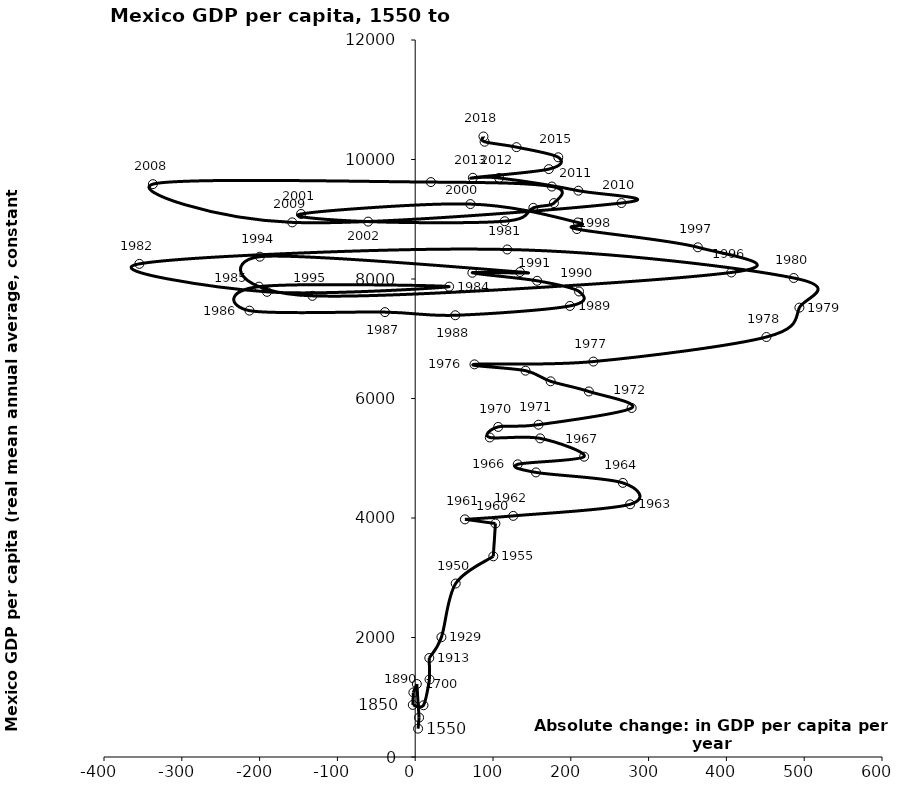
| Category | Series 0 |
|---|---|
| 3.7101737016481366 | 474.541 |
| 4.979321759390445 | 660.05 |
| 2.1017369751845716 | 1221.439 |
| -2.329859390672925 | 1080.397 |
| -3.066997522229198 | 871.96 |
| 10.647642692463993 | 865.707 |
| 18.403831748877394 | 1297.866 |
| 18.135776569085767 | 1657.072 |
| 33.687881469565525 | 2005.161 |
| 52.05573588886899 | 2903.524 |
| 100.39702245096551 | 3358.61 |
| 103.08616733249096 | 3907.494 |
| 63.9202822675079 | 3977.127 |
| 126.01696093861915 | 4035.334 |
| 276.2594431723455 | 4229.161 |
| 266.89291940906696 | 4587.853 |
| 155.24396717794934 | 4762.947 |
| 131.78300063867346 | 4898.341 |
| 217.11963046942174 | 5026.513 |
| 160.63544024253633 | 5332.58 |
| 95.84596925461256 | 5347.784 |
| 106.6988991631406 | 5524.272 |
| 158.4749773660169 | 5561.182 |
| 278.2036413939818 | 5841.222 |
| 223.206261420165 | 6117.589 |
| 174.0899496890429 | 6287.635 |
| 141.79812849616064 | 6465.769 |
| 76.18499332830515 | 6571.231 |
| 229.00482518857098 | 6618.139 |
| 451.4212857674647 | 7029.241 |
| 493.82198685687354 | 7520.982 |
| 486.5152448884364 | 8016.885 |
| 118.28073247406837 | 8494.012 |
| -354.5764555137762 | 8253.446 |
| -190.49425641695962 | 7784.859 |
| 43.57926317957663 | 7872.458 |
| -200.83250691853982 | 7872.018 |
| -213.08201294726769 | 7470.793 |
| -38.84220091156794 | 7445.854 |
| 51.56149081827107 | 7393.108 |
| 198.8456961505176 | 7548.977 |
| 210.58386171205302 | 7790.8 |
| 156.7457020456759 | 7970.144 |
| 73.47271051072948 | 8104.291 |
| 134.6112256128531 | 8117.09 |
| -199.6841424786735 | 8373.514 |
| -132.15741510048656 | 7717.722 |
| 406.3167770230616 | 8109.199 |
| 363.3384225698869 | 8530.355 |
| 207.88889593941985 | 8835.876 |
| 209.0462513498769 | 8946.133 |
| 70.960220789706 | 9253.968 |
| -146.706979857212 | 9088.053 |
| -60.51206423046551 | 8960.554 |
| 115.0937529081184 | 8967.029 |
| 151.8136759844101 | 9190.742 |
| 178.29598919748878 | 9270.657 |
| 175.69570735235175 | 9547.334 |
| 20.1513843234452 | 9622.048 |
| -337.15324155915187 | 9587.636 |
| -158.1190530418644 | 8947.741 |
| 265.07285560859054 | 9271.398 |
| 209.73541564297102 | 9477.887 |
| 107.91789192722172 | 9690.869 |
| 74.09056318183411 | 9693.723 |
| 171.73926073249277 | 9839.05 |
| 183.92163138615888 | 10037.201 |
| 130.19235888254025 | 10206.893 |
| 89.20219620382886 | 10297.586 |
| 87.71163790123319 | 10385.298 |